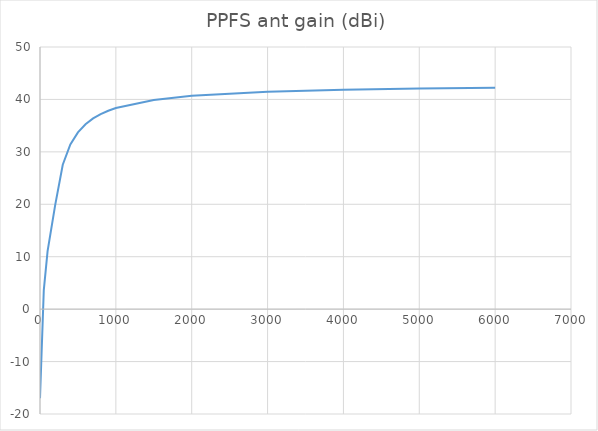
| Category | PPFS ant gain (dBi) |
|---|---|
| 0.0 | -17 |
| 50.0 | 3.641 |
| 100.0 | 11.057 |
| 200.0 | 19.839 |
| 300.0 | 27.543 |
| 400.0 | 31.403 |
| 500.0 | 33.721 |
| 600.0 | 35.267 |
| 700.0 | 36.371 |
| 800.0 | 37.199 |
| 900.0 | 37.844 |
| 1000.0 | 38.359 |
| 1500.0 | 39.906 |
| 2000.0 | 40.68 |
| 3000.0 | 41.453 |
| 4000.0 | 41.84 |
| 5000.0 | 42.072 |
| 6000.0 | 42.227 |